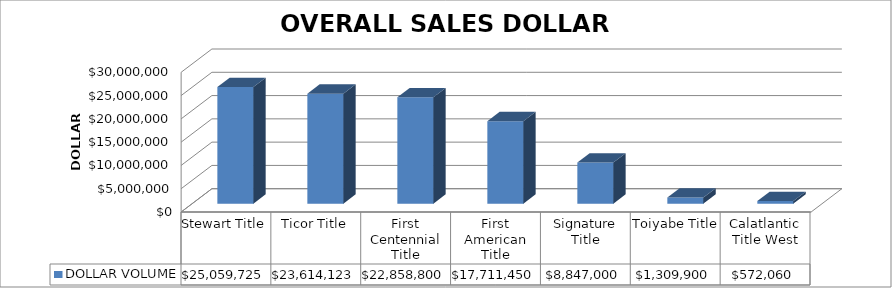
| Category | DOLLAR VOLUME |
|---|---|
| Stewart Title | 25059725 |
| Ticor Title | 23614123 |
| First Centennial Title | 22858800 |
| First American Title | 17711450 |
| Signature Title | 8847000 |
| Toiyabe Title | 1309900 |
| Calatlantic Title West | 572060 |